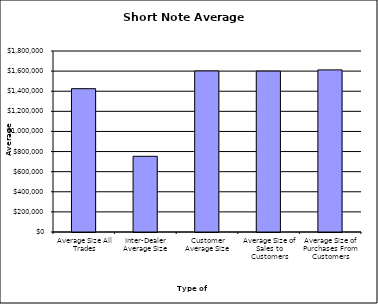
| Category | Security Type |
|---|---|
| Average Size All Trades | 1425272.208 |
| Inter-Dealer Average Size | 752822.967 |
| Customer Average Size | 1601832.373 |
| Average Size of Sales to Customers | 1600208.676 |
| Average Size of Purchases From Customers | 1612175.926 |